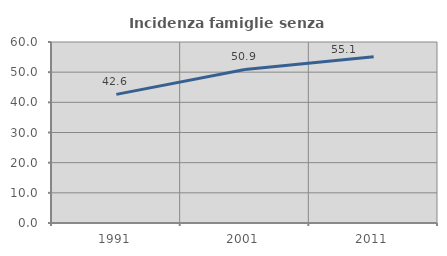
| Category | Incidenza famiglie senza nuclei |
|---|---|
| 1991.0 | 42.632 |
| 2001.0 | 50.886 |
| 2011.0 | 55.11 |